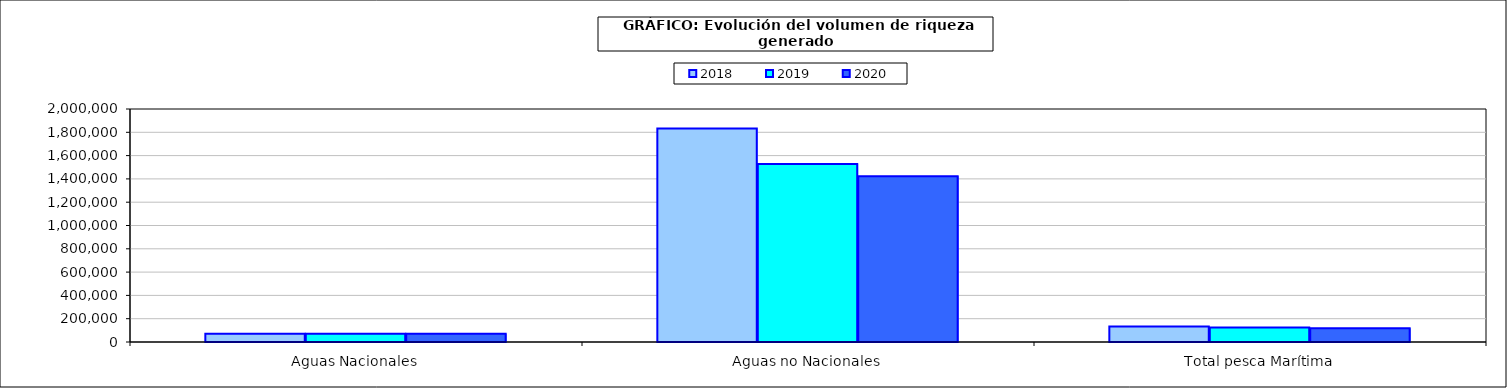
| Category | 2018 | 2019 | 2020 |
|---|---|---|---|
| 0 | 71758.407 | 71713.906 | 70812.188 |
| 1 | 1832597.322 | 1527052.017 | 1423788.088 |
| 2 | 133139.433 | 123662.367 | 118667.24 |